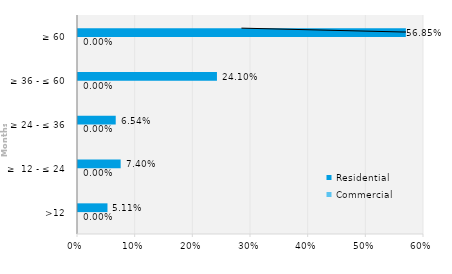
| Category | Commercial | Residential |
|---|---|---|
| >12 | 0 | 0.051 |
| ≥  12 - ≤ 24 | 0 | 0.074 |
| ≥ 24 - ≤ 36 | 0 | 0.065 |
| ≥ 36 - ≤ 60 | 0 | 0.241 |
| ≥ 60 | 0 | 0.569 |